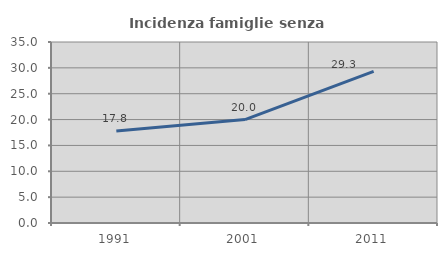
| Category | Incidenza famiglie senza nuclei |
|---|---|
| 1991.0 | 17.805 |
| 2001.0 | 20 |
| 2011.0 | 29.33 |